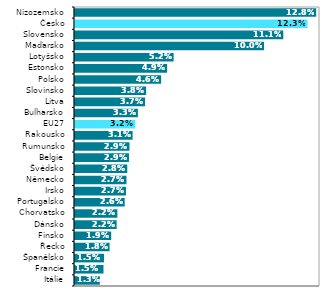
| Category | Series 0 |
|---|---|
| Itálie | 0.013 |
| Francie | 0.015 |
| Španělsko | 0.015 |
| Řecko | 0.018 |
| Finsko | 0.019 |
| Dánsko | 0.022 |
| Chorvatsko | 0.022 |
| Portugalsko | 0.026 |
| Irsko | 0.027 |
| Německo | 0.027 |
| Švédsko | 0.028 |
| Belgie | 0.029 |
| Rumunsko | 0.029 |
| Rakousko | 0.031 |
| EU27 | 0.032 |
| Bulharsko | 0.033 |
| Litva | 0.037 |
| Slovinsko | 0.038 |
| Polsko | 0.046 |
| Estonsko | 0.049 |
| Lotyšsko | 0.052 |
| Maďarsko | 0.1 |
| Slovensko | 0.111 |
| Česko | 0.123 |
| Nizozemsko | 0.128 |